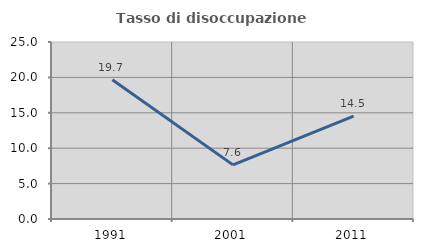
| Category | Tasso di disoccupazione giovanile  |
|---|---|
| 1991.0 | 19.658 |
| 2001.0 | 7.643 |
| 2011.0 | 14.545 |